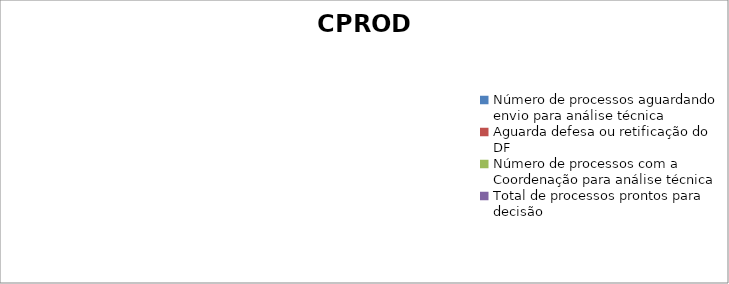
| Category | CPROD |
|---|---|
| Número de processos aguardando envio para análise técnica | 0 |
| Aguarda defesa ou retificação do DF | 0 |
| Número de processos com a Coordenação para análise técnica | 0 |
| Total de processos prontos para decisão | 0 |